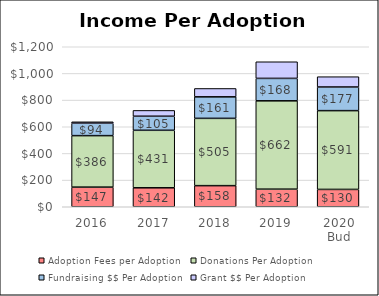
| Category | Adoption Fees per Adoption | Donations Per Adoption | Fundraising $$ Per Adoption | Grant $$ Per Adoption |
|---|---|---|---|---|
| 2016 | 147.217 | 386.197 | 93.628 | 10.064 |
| 2017 | 142.234 | 431.205 | 105.456 | 43.646 |
| 2018 | 158.241 | 504.69 | 161.421 | 62.763 |
| 2019 | 131.922 | 662.499 | 168.347 | 124.627 |
| 2020 Bud | 130 | 590.909 | 177.273 | 77.273 |